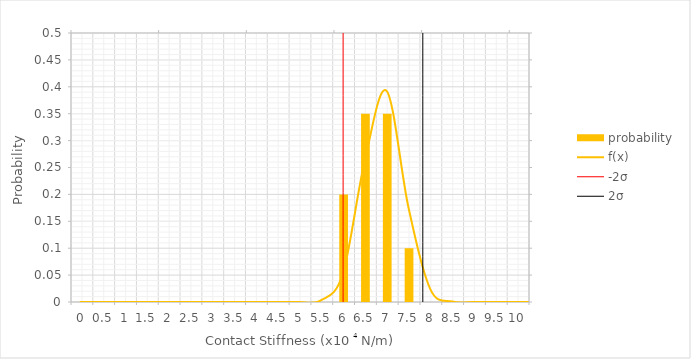
| Category | probability |
|---|---|
| 0.0 | 0 |
| 0.5 | 0 |
| 1.0 | 0 |
| 1.5 | 0 |
| 2.0 | 0 |
| 2.5 | 0 |
| 3.0 | 0 |
| 3.5 | 0 |
| 4.0 | 0 |
| 4.5 | 0 |
| 5.0 | 0 |
| 5.5 | 0 |
| 6.0 | 0.2 |
| 6.5 | 0.35 |
| 7.0 | 0.35 |
| 7.5 | 0.1 |
| 8.0 | 0 |
| 8.5 | 0 |
| 9.0 | 0 |
| 9.5 | 0 |
| 10.0 | 0 |